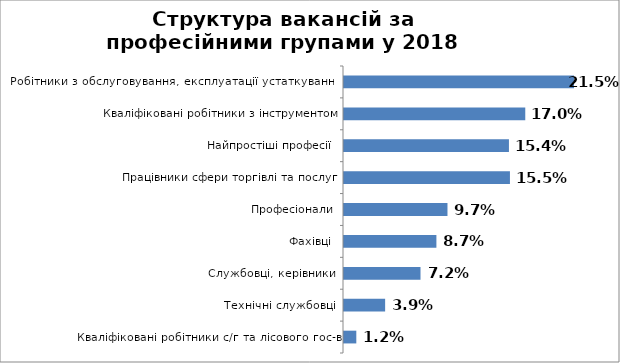
| Category | Series 0 |
|---|---|
| Робітники з обслуговування, експлуатації устаткування  | 0.215 |
| Кваліфіковані робітники з інструментом | 0.17 |
| Найпростіші професії  | 0.154 |
| Працівники сфери торгівлі та послуг | 0.155 |
| Професіонали | 0.097 |
| Фахівці | 0.087 |
| Службовці, керівники | 0.072 |
| Технічні службовці | 0.039 |
| Кваліфіковані робітники с/г та лісового гос-в | 0.012 |